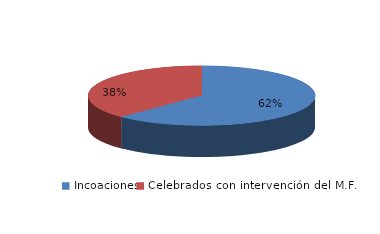
| Category | Series 0 |
|---|---|
| Incoaciones | 15971 |
| Celebrados con intervención del M.F. | 9625 |